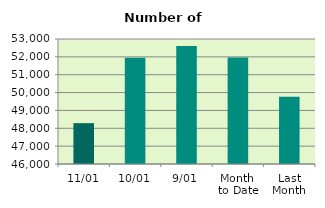
| Category | Series 0 |
|---|---|
| 11/01 | 48288 |
| 10/01 | 51944 |
| 9/01 | 52608 |
| Month 
to Date | 51965.429 |
| Last
Month | 49764 |